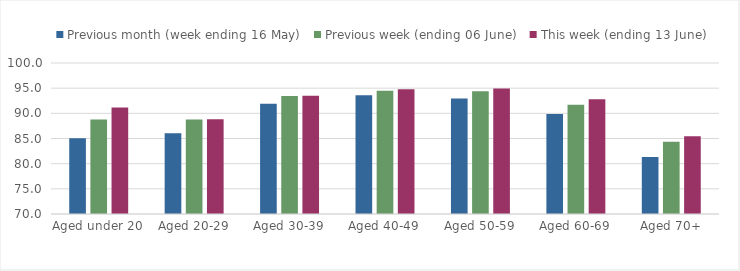
| Category | Previous month (week ending 16 May) | Previous week (ending 06 June) | This week (ending 13 June) |
|---|---|---|---|
| Aged under 20 | 85.027 | 88.767 | 91.156 |
| Aged 20-29 | 86.062 | 88.785 | 88.844 |
| Aged 30-39 | 91.927 | 93.467 | 93.481 |
| Aged 40-49 | 93.573 | 94.47 | 94.784 |
| Aged 50-59 | 92.946 | 94.37 | 94.911 |
| Aged 60-69 | 89.881 | 91.726 | 92.801 |
| Aged 70+ | 81.325 | 84.346 | 85.471 |